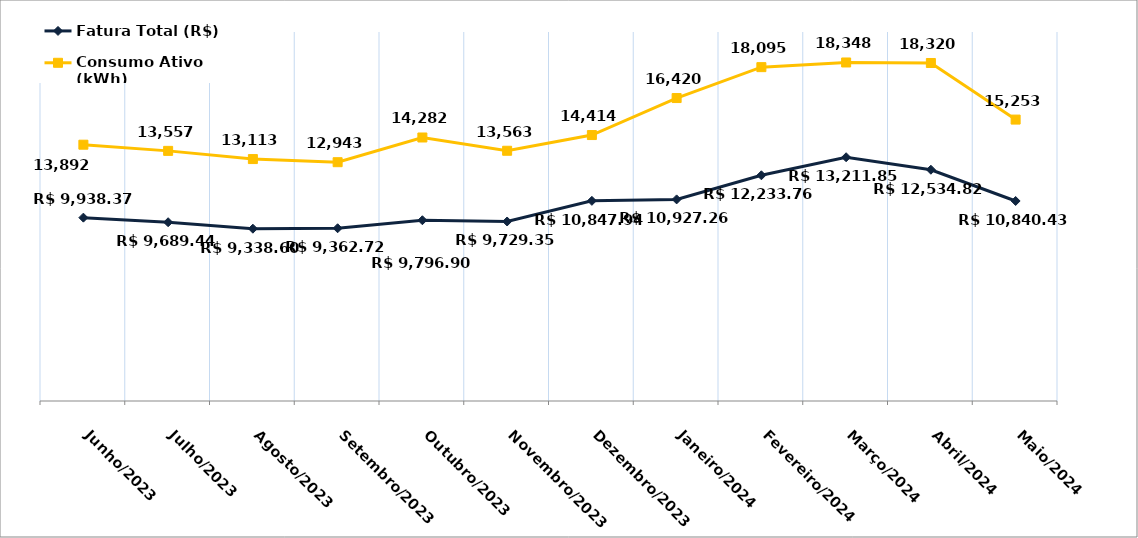
| Category | Fatura Total (R$) | Consumo Ativo (kWh) |
|---|---|---|
| Junho/2023 | 9938.37 | 13892 |
| Julho/2023 | 9689.44 | 13557 |
| Agosto/2023 | 9338.6 | 13113 |
| Setembro/2023 | 9362.72 | 12943 |
| Outubro/2023 | 9796.9 | 14282 |
| Novembro/2023 | 9729.35 | 13563 |
| Dezembro/2023 | 10847.94 | 14414 |
| Janeiro/2024 | 10927.26 | 16420 |
| Fevereiro/2024 | 12233.76 | 18095 |
| Março/2024 | 13211.85 | 18348 |
| Abril/2024 | 12534.82 | 18320 |
| Maio/2024 | 10840.43 | 15253 |